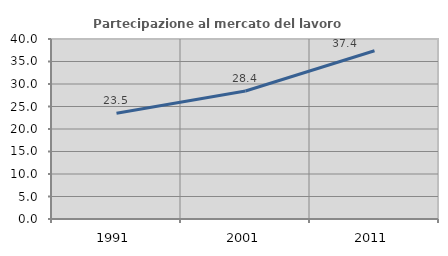
| Category | Partecipazione al mercato del lavoro  femminile |
|---|---|
| 1991.0 | 23.517 |
| 2001.0 | 28.438 |
| 2011.0 | 37.389 |